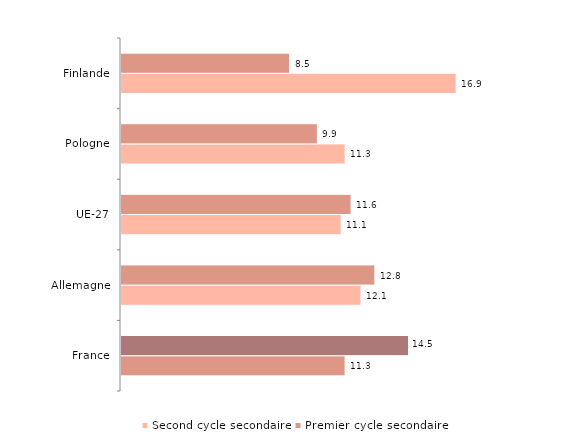
| Category | Second cycle secondaire | Premier cycle secondaire |
|---|---|---|
| France | 11.3 | 14.5 |
| Allemagne | 12.1 | 12.8 |
| UE-27 | 11.1 | 11.6 |
| Pologne | 11.3 | 9.9 |
| Finlande | 16.9 | 8.5 |